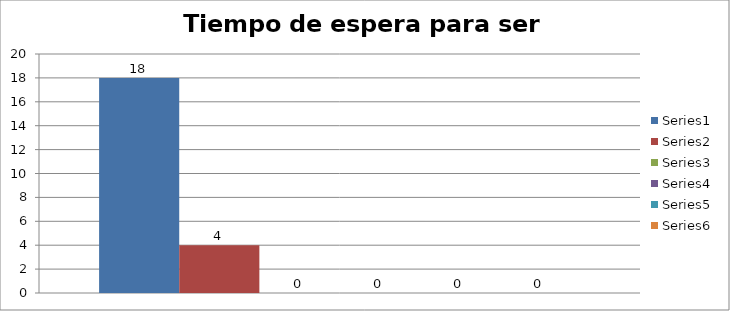
| Category | Series 0 | Series 1 | Series 2 | Series 3 | Series 4 | Series 5 |
|---|---|---|---|---|---|---|
| 0 | 18 | 4 | 0 | 0 | 0 | 0 |